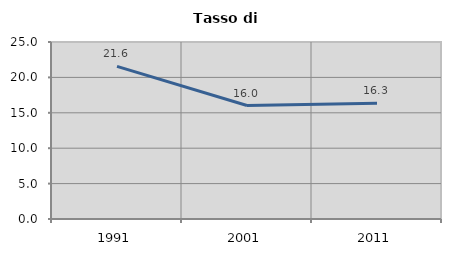
| Category | Tasso di disoccupazione   |
|---|---|
| 1991.0 | 21.56 |
| 2001.0 | 16.029 |
| 2011.0 | 16.342 |